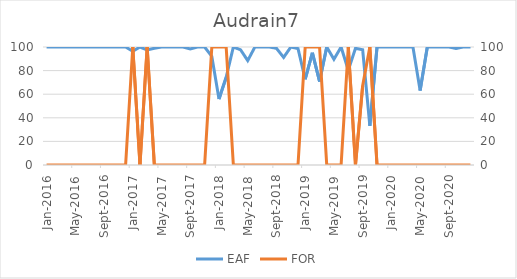
| Category | EAF |
|---|---|
| 2016-01-01 | 100 |
| 2016-02-01 | 100 |
| 2016-03-01 | 100 |
| 2016-04-01 | 100 |
| 2016-05-01 | 100 |
| 2016-06-01 | 100 |
| 2016-07-01 | 100 |
| 2016-08-01 | 100 |
| 2016-09-01 | 100 |
| 2016-10-01 | 100 |
| 2016-11-01 | 100 |
| 2016-12-01 | 100 |
| 2017-01-01 | 96.39 |
| 2017-02-01 | 100 |
| 2017-03-01 | 97.51 |
| 2017-04-01 | 98.96 |
| 2017-05-01 | 100 |
| 2017-06-01 | 100 |
| 2017-07-01 | 100 |
| 2017-08-01 | 100 |
| 2017-09-01 | 98.37 |
| 2017-10-01 | 100 |
| 2017-11-01 | 100 |
| 2017-12-01 | 92 |
| 2018-01-01 | 55.84 |
| 2018-02-01 | 74.36 |
| 2018-03-01 | 100 |
| 2018-04-01 | 97.64 |
| 2018-05-01 | 88.5 |
| 2018-06-01 | 100 |
| 2018-07-01 | 100 |
| 2018-08-01 | 100 |
| 2018-09-01 | 98.89 |
| 2018-10-01 | 91.16 |
| 2018-11-01 | 100 |
| 2018-12-01 | 98.66 |
| 2019-01-01 | 72.65 |
| 2019-02-01 | 95.09 |
| 2019-03-01 | 70.8 |
| 2019-04-01 | 100 |
| 2019-05-01 | 89.53 |
| 2019-06-01 | 100 |
| 2019-07-01 | 80.32 |
| 2019-08-01 | 98.91 |
| 2019-09-01 | 97.64 |
| 2019-10-01 | 33.25 |
| 2019-11-01 | 100 |
| 2019-12-01 | 100 |
| 2020-01-01 | 100 |
| 2020-02-01 | 100 |
| 2020-03-01 | 100 |
| 2020-04-01 | 100 |
| 2020-05-01 | 63.05 |
| 2020-06-01 | 100 |
| 2020-07-01 | 100 |
| 2020-08-01 | 100 |
| 2020-09-01 | 100 |
| 2020-10-01 | 98.74 |
| 2020-11-01 | 100 |
| 2020-12-01 | 100 |